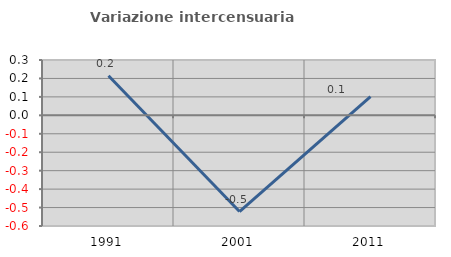
| Category | Variazione intercensuaria annua |
|---|---|
| 1991.0 | 0.214 |
| 2001.0 | -0.522 |
| 2011.0 | 0.102 |